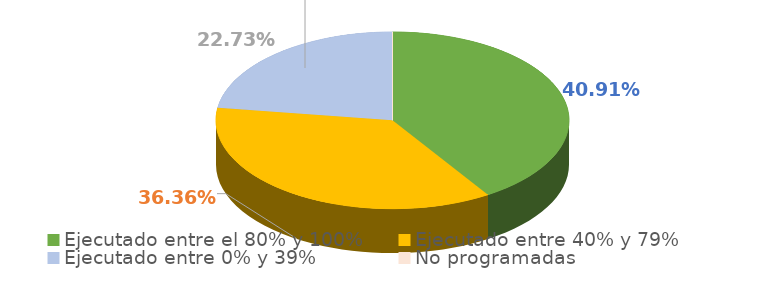
| Category | Series 0 |
|---|---|
| Ejecutado entre el 80% y 100% | 0.409 |
| Ejecutado entre 40% y 79% | 0.364 |
| Ejecutado entre 0% y 39% | 0.227 |
| No programadas | 0 |